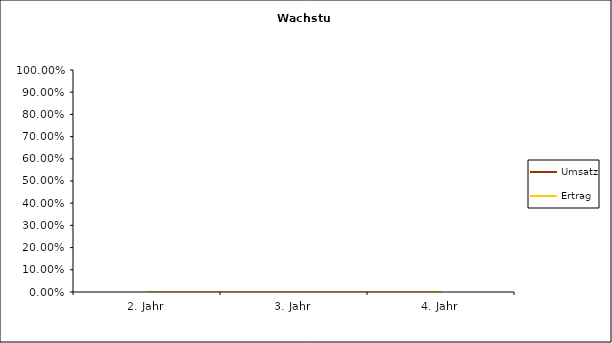
| Category | Umsatz | Ertrag |
|---|---|---|
| 2. Jahr | 0 | 0 |
| 3. Jahr | 0 | 0 |
| 4. Jahr | 0 | 0 |